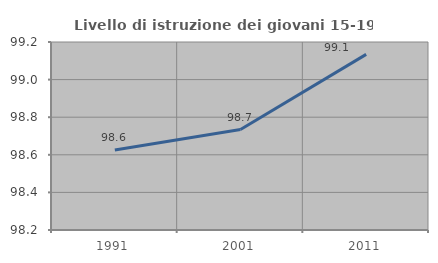
| Category | Livello di istruzione dei giovani 15-19 anni |
|---|---|
| 1991.0 | 98.625 |
| 2001.0 | 98.734 |
| 2011.0 | 99.134 |